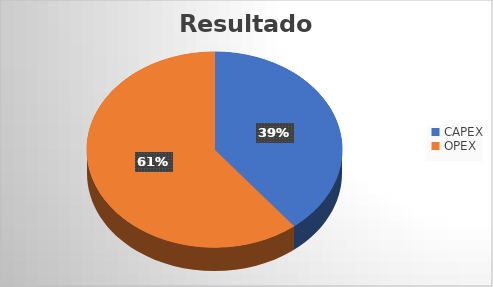
| Category | Resultados |
|---|---|
| CAPEX | 640850139.357 |
| OPEX | 990181359.116 |